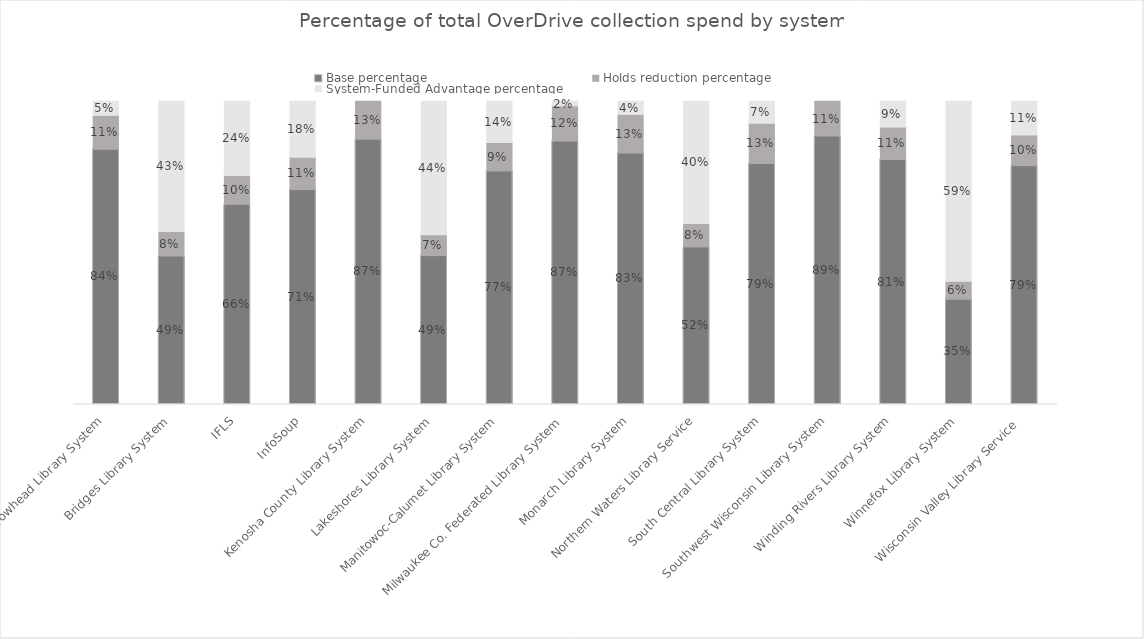
| Category | Base percentage | Holds reduction percentage | System-Funded Advantage percentage |
|---|---|---|---|
| Arrowhead Library System | 0.842 | 0.112 | 0.047 |
| Bridges Library System | 0.49 | 0.081 | 0.43 |
| IFLS | 0.66 | 0.095 | 0.245 |
| InfoSoup | 0.708 | 0.107 | 0.185 |
| Kenosha County Library System | 0.875 | 0.125 | 0 |
| Lakeshores Library System | 0.491 | 0.069 | 0.44 |
| Manitowoc-Calumet Library System | 0.77 | 0.094 | 0.136 |
| Milwaukee Co. Federated Library System | 0.869 | 0.116 | 0.015 |
| Monarch Library System | 0.829 | 0.127 | 0.044 |
| Northern Waters Library Service | 0.519 | 0.077 | 0.404 |
| South Central Library System | 0.794 | 0.133 | 0.073 |
| Southwest Wisconsin Library System | 0.885 | 0.115 | 0 |
| Winding Rivers Library System | 0.807 | 0.107 | 0.085 |
| Winnefox Library System | 0.347 | 0.06 | 0.593 |
| Wisconsin Valley Library Service  | 0.787 | 0.101 | 0.112 |